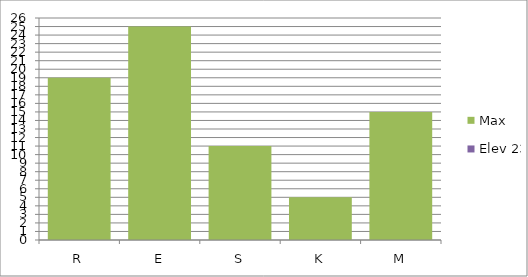
| Category | Max | Elev 23 |
|---|---|---|
| R | 19 | 0 |
| E | 25 | 0 |
| S | 11 | 0 |
| K | 5 | 0 |
| M | 15 | 0 |